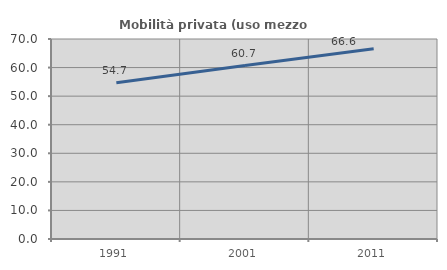
| Category | Mobilità privata (uso mezzo privato) |
|---|---|
| 1991.0 | 54.687 |
| 2001.0 | 60.723 |
| 2011.0 | 66.603 |